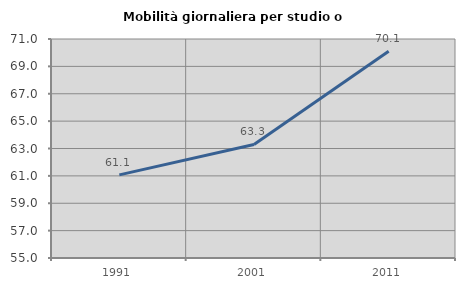
| Category | Mobilità giornaliera per studio o lavoro |
|---|---|
| 1991.0 | 61.074 |
| 2001.0 | 63.297 |
| 2011.0 | 70.104 |